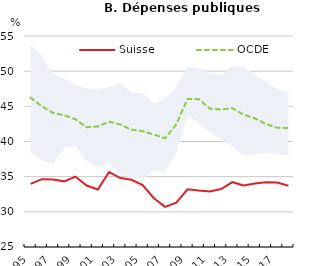
| Category | Suisse | OCDE |
|---|---|---|
| 1995.0 | 33.975 | 46.238 |
| 1996.0 | 34.644 | 45.006 |
| 1997.0 | 34.585 | 44.059 |
| 1998.0 | 34.334 | 43.73 |
| 1999.0 | 35.016 | 43.162 |
| 2000.0 | 33.737 | 42.03 |
| 2001.0 | 33.167 | 42.141 |
| 2002.0 | 35.668 | 42.82 |
| 2003.0 | 34.795 | 42.406 |
| 2004.0 | 34.56 | 41.681 |
| 2005.0 | 33.791 | 41.46 |
| 2006.0 | 31.929 | 40.989 |
| 2007.0 | 30.703 | 40.45 |
| 2008.0 | 31.313 | 42.451 |
| 2009.0 | 33.197 | 46.057 |
| 2010.0 | 33.024 | 46.021 |
| 2011.0 | 32.894 | 44.674 |
| 2012.0 | 33.234 | 44.546 |
| 2013.0 | 34.217 | 44.742 |
| 2014.0 | 33.76 | 43.831 |
| 2015.0 | 34.014 | 43.297 |
| 2016.0 | 34.199 | 42.489 |
| 2017.0 | 34.162 | 41.958 |
| 2018.0 | 33.712 | 41.924 |